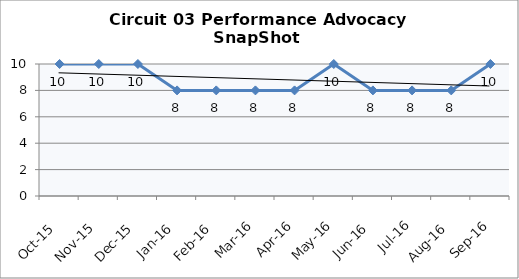
| Category | Circuit 03 |
|---|---|
| Oct-15 | 10 |
| Nov-15 | 10 |
| Dec-15 | 10 |
| Jan-16 | 8 |
| Feb-16 | 8 |
| Mar-16 | 8 |
| Apr-16 | 8 |
| May-16 | 10 |
| Jun-16 | 8 |
| Jul-16 | 8 |
| Aug-16 | 8 |
| Sep-16 | 10 |